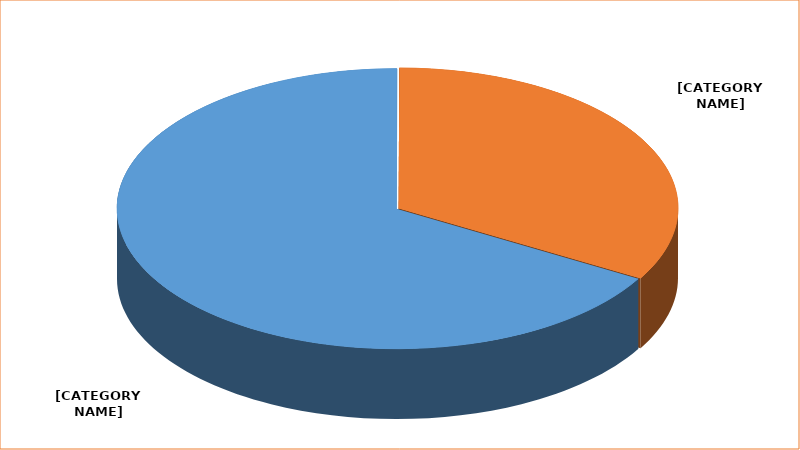
| Category | Series 0 |
|---|---|
| Male | 0.667 |
| Female | 0.333 |